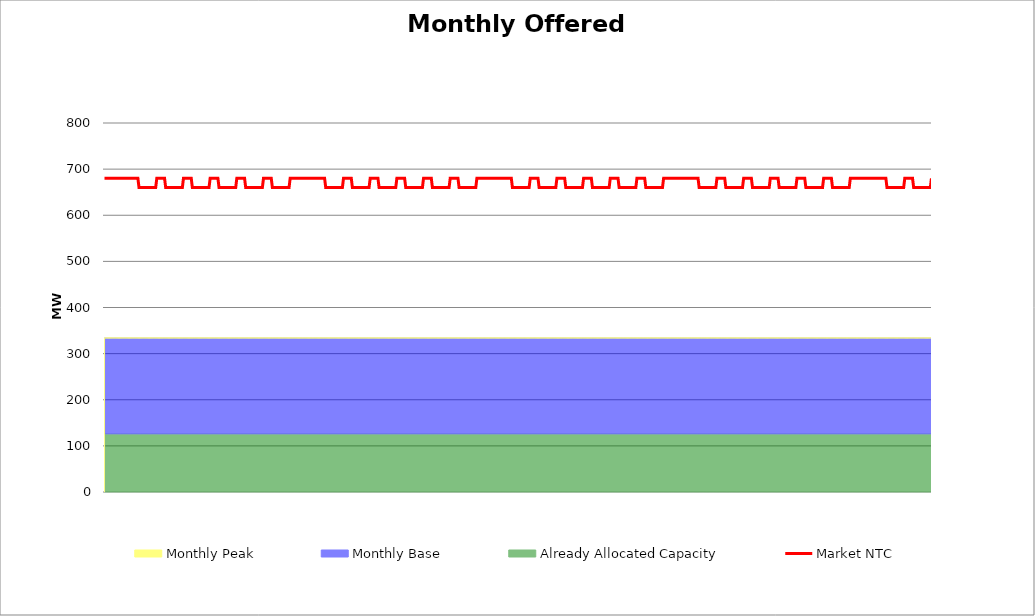
| Category | Market NTC |
|---|---|
| 0 | 680 |
| 1 | 680 |
| 2 | 680 |
| 3 | 680 |
| 4 | 680 |
| 5 | 680 |
| 6 | 680 |
| 7 | 680 |
| 8 | 680 |
| 9 | 680 |
| 10 | 680 |
| 11 | 680 |
| 12 | 680 |
| 13 | 680 |
| 14 | 680 |
| 15 | 680 |
| 16 | 680 |
| 17 | 680 |
| 18 | 680 |
| 19 | 680 |
| 20 | 680 |
| 21 | 680 |
| 22 | 680 |
| 23 | 680 |
| 24 | 680 |
| 25 | 680 |
| 26 | 680 |
| 27 | 680 |
| 28 | 680 |
| 29 | 680 |
| 30 | 680 |
| 31 | 660 |
| 32 | 660 |
| 33 | 660 |
| 34 | 660 |
| 35 | 660 |
| 36 | 660 |
| 37 | 660 |
| 38 | 660 |
| 39 | 660 |
| 40 | 660 |
| 41 | 660 |
| 42 | 660 |
| 43 | 660 |
| 44 | 660 |
| 45 | 660 |
| 46 | 660 |
| 47 | 680 |
| 48 | 680 |
| 49 | 680 |
| 50 | 680 |
| 51 | 680 |
| 52 | 680 |
| 53 | 680 |
| 54 | 680 |
| 55 | 660 |
| 56 | 660 |
| 57 | 660 |
| 58 | 660 |
| 59 | 660 |
| 60 | 660 |
| 61 | 660 |
| 62 | 660 |
| 63 | 660 |
| 64 | 660 |
| 65 | 660 |
| 66 | 660 |
| 67 | 660 |
| 68 | 660 |
| 69 | 660 |
| 70 | 660 |
| 71 | 680 |
| 72 | 680 |
| 73 | 680 |
| 74 | 680 |
| 75 | 680 |
| 76 | 680 |
| 77 | 680 |
| 78 | 680 |
| 79 | 660 |
| 80 | 660 |
| 81 | 660 |
| 82 | 660 |
| 83 | 660 |
| 84 | 660 |
| 85 | 660 |
| 86 | 660 |
| 87 | 660 |
| 88 | 660 |
| 89 | 660 |
| 90 | 660 |
| 91 | 660 |
| 92 | 660 |
| 93 | 660 |
| 94 | 660 |
| 95 | 680 |
| 96 | 680 |
| 97 | 680 |
| 98 | 680 |
| 99 | 680 |
| 100 | 680 |
| 101 | 680 |
| 102 | 680 |
| 103 | 660 |
| 104 | 660 |
| 105 | 660 |
| 106 | 660 |
| 107 | 660 |
| 108 | 660 |
| 109 | 660 |
| 110 | 660 |
| 111 | 660 |
| 112 | 660 |
| 113 | 660 |
| 114 | 660 |
| 115 | 660 |
| 116 | 660 |
| 117 | 660 |
| 118 | 660 |
| 119 | 680 |
| 120 | 680 |
| 121 | 680 |
| 122 | 680 |
| 123 | 680 |
| 124 | 680 |
| 125 | 680 |
| 126 | 680 |
| 127 | 660 |
| 128 | 660 |
| 129 | 660 |
| 130 | 660 |
| 131 | 660 |
| 132 | 660 |
| 133 | 660 |
| 134 | 660 |
| 135 | 660 |
| 136 | 660 |
| 137 | 660 |
| 138 | 660 |
| 139 | 660 |
| 140 | 660 |
| 141 | 660 |
| 142 | 660 |
| 143 | 680 |
| 144 | 680 |
| 145 | 680 |
| 146 | 680 |
| 147 | 680 |
| 148 | 680 |
| 149 | 680 |
| 150 | 680 |
| 151 | 660 |
| 152 | 660 |
| 153 | 660 |
| 154 | 660 |
| 155 | 660 |
| 156 | 660 |
| 157 | 660 |
| 158 | 660 |
| 159 | 660 |
| 160 | 660 |
| 161 | 660 |
| 162 | 660 |
| 163 | 660 |
| 164 | 660 |
| 165 | 660 |
| 166 | 660 |
| 167 | 680 |
| 168 | 680 |
| 169 | 680 |
| 170 | 680 |
| 171 | 680 |
| 172 | 680 |
| 173 | 680 |
| 174 | 680 |
| 175 | 680 |
| 176 | 680 |
| 177 | 680 |
| 178 | 680 |
| 179 | 680 |
| 180 | 680 |
| 181 | 680 |
| 182 | 680 |
| 183 | 680 |
| 184 | 680 |
| 185 | 680 |
| 186 | 680 |
| 187 | 680 |
| 188 | 680 |
| 189 | 680 |
| 190 | 680 |
| 191 | 680 |
| 192 | 680 |
| 193 | 680 |
| 194 | 680 |
| 195 | 680 |
| 196 | 680 |
| 197 | 680 |
| 198 | 680 |
| 199 | 660 |
| 200 | 660 |
| 201 | 660 |
| 202 | 660 |
| 203 | 660 |
| 204 | 660 |
| 205 | 660 |
| 206 | 660 |
| 207 | 660 |
| 208 | 660 |
| 209 | 660 |
| 210 | 660 |
| 211 | 660 |
| 212 | 660 |
| 213 | 660 |
| 214 | 660 |
| 215 | 680 |
| 216 | 680 |
| 217 | 680 |
| 218 | 680 |
| 219 | 680 |
| 220 | 680 |
| 221 | 680 |
| 222 | 680 |
| 223 | 660 |
| 224 | 660 |
| 225 | 660 |
| 226 | 660 |
| 227 | 660 |
| 228 | 660 |
| 229 | 660 |
| 230 | 660 |
| 231 | 660 |
| 232 | 660 |
| 233 | 660 |
| 234 | 660 |
| 235 | 660 |
| 236 | 660 |
| 237 | 660 |
| 238 | 660 |
| 239 | 680 |
| 240 | 680 |
| 241 | 680 |
| 242 | 680 |
| 243 | 680 |
| 244 | 680 |
| 245 | 680 |
| 246 | 680 |
| 247 | 660 |
| 248 | 660 |
| 249 | 660 |
| 250 | 660 |
| 251 | 660 |
| 252 | 660 |
| 253 | 660 |
| 254 | 660 |
| 255 | 660 |
| 256 | 660 |
| 257 | 660 |
| 258 | 660 |
| 259 | 660 |
| 260 | 660 |
| 261 | 660 |
| 262 | 660 |
| 263 | 680 |
| 264 | 680 |
| 265 | 680 |
| 266 | 680 |
| 267 | 680 |
| 268 | 680 |
| 269 | 680 |
| 270 | 680 |
| 271 | 660 |
| 272 | 660 |
| 273 | 660 |
| 274 | 660 |
| 275 | 660 |
| 276 | 660 |
| 277 | 660 |
| 278 | 660 |
| 279 | 660 |
| 280 | 660 |
| 281 | 660 |
| 282 | 660 |
| 283 | 660 |
| 284 | 660 |
| 285 | 660 |
| 286 | 660 |
| 287 | 680 |
| 288 | 680 |
| 289 | 680 |
| 290 | 680 |
| 291 | 680 |
| 292 | 680 |
| 293 | 680 |
| 294 | 680 |
| 295 | 660 |
| 296 | 660 |
| 297 | 660 |
| 298 | 660 |
| 299 | 660 |
| 300 | 660 |
| 301 | 660 |
| 302 | 660 |
| 303 | 660 |
| 304 | 660 |
| 305 | 660 |
| 306 | 660 |
| 307 | 660 |
| 308 | 660 |
| 309 | 660 |
| 310 | 660 |
| 311 | 680 |
| 312 | 680 |
| 313 | 680 |
| 314 | 680 |
| 315 | 680 |
| 316 | 680 |
| 317 | 680 |
| 318 | 680 |
| 319 | 660 |
| 320 | 660 |
| 321 | 660 |
| 322 | 660 |
| 323 | 660 |
| 324 | 660 |
| 325 | 660 |
| 326 | 660 |
| 327 | 660 |
| 328 | 660 |
| 329 | 660 |
| 330 | 660 |
| 331 | 660 |
| 332 | 660 |
| 333 | 660 |
| 334 | 660 |
| 335 | 680 |
| 336 | 680 |
| 337 | 680 |
| 338 | 680 |
| 339 | 680 |
| 340 | 680 |
| 341 | 680 |
| 342 | 680 |
| 343 | 680 |
| 344 | 680 |
| 345 | 680 |
| 346 | 680 |
| 347 | 680 |
| 348 | 680 |
| 349 | 680 |
| 350 | 680 |
| 351 | 680 |
| 352 | 680 |
| 353 | 680 |
| 354 | 680 |
| 355 | 680 |
| 356 | 680 |
| 357 | 680 |
| 358 | 680 |
| 359 | 680 |
| 360 | 680 |
| 361 | 680 |
| 362 | 680 |
| 363 | 680 |
| 364 | 680 |
| 365 | 680 |
| 366 | 680 |
| 367 | 660 |
| 368 | 660 |
| 369 | 660 |
| 370 | 660 |
| 371 | 660 |
| 372 | 660 |
| 373 | 660 |
| 374 | 660 |
| 375 | 660 |
| 376 | 660 |
| 377 | 660 |
| 378 | 660 |
| 379 | 660 |
| 380 | 660 |
| 381 | 660 |
| 382 | 660 |
| 383 | 680 |
| 384 | 680 |
| 385 | 680 |
| 386 | 680 |
| 387 | 680 |
| 388 | 680 |
| 389 | 680 |
| 390 | 680 |
| 391 | 660 |
| 392 | 660 |
| 393 | 660 |
| 394 | 660 |
| 395 | 660 |
| 396 | 660 |
| 397 | 660 |
| 398 | 660 |
| 399 | 660 |
| 400 | 660 |
| 401 | 660 |
| 402 | 660 |
| 403 | 660 |
| 404 | 660 |
| 405 | 660 |
| 406 | 660 |
| 407 | 680 |
| 408 | 680 |
| 409 | 680 |
| 410 | 680 |
| 411 | 680 |
| 412 | 680 |
| 413 | 680 |
| 414 | 680 |
| 415 | 660 |
| 416 | 660 |
| 417 | 660 |
| 418 | 660 |
| 419 | 660 |
| 420 | 660 |
| 421 | 660 |
| 422 | 660 |
| 423 | 660 |
| 424 | 660 |
| 425 | 660 |
| 426 | 660 |
| 427 | 660 |
| 428 | 660 |
| 429 | 660 |
| 430 | 660 |
| 431 | 680 |
| 432 | 680 |
| 433 | 680 |
| 434 | 680 |
| 435 | 680 |
| 436 | 680 |
| 437 | 680 |
| 438 | 680 |
| 439 | 660 |
| 440 | 660 |
| 441 | 660 |
| 442 | 660 |
| 443 | 660 |
| 444 | 660 |
| 445 | 660 |
| 446 | 660 |
| 447 | 660 |
| 448 | 660 |
| 449 | 660 |
| 450 | 660 |
| 451 | 660 |
| 452 | 660 |
| 453 | 660 |
| 454 | 660 |
| 455 | 680 |
| 456 | 680 |
| 457 | 680 |
| 458 | 680 |
| 459 | 680 |
| 460 | 680 |
| 461 | 680 |
| 462 | 680 |
| 463 | 660 |
| 464 | 660 |
| 465 | 660 |
| 466 | 660 |
| 467 | 660 |
| 468 | 660 |
| 469 | 660 |
| 470 | 660 |
| 471 | 660 |
| 472 | 660 |
| 473 | 660 |
| 474 | 660 |
| 475 | 660 |
| 476 | 660 |
| 477 | 660 |
| 478 | 660 |
| 479 | 680 |
| 480 | 680 |
| 481 | 680 |
| 482 | 680 |
| 483 | 680 |
| 484 | 680 |
| 485 | 680 |
| 486 | 680 |
| 487 | 660 |
| 488 | 660 |
| 489 | 660 |
| 490 | 660 |
| 491 | 660 |
| 492 | 660 |
| 493 | 660 |
| 494 | 660 |
| 495 | 660 |
| 496 | 660 |
| 497 | 660 |
| 498 | 660 |
| 499 | 660 |
| 500 | 660 |
| 501 | 660 |
| 502 | 660 |
| 503 | 680 |
| 504 | 680 |
| 505 | 680 |
| 506 | 680 |
| 507 | 680 |
| 508 | 680 |
| 509 | 680 |
| 510 | 680 |
| 511 | 680 |
| 512 | 680 |
| 513 | 680 |
| 514 | 680 |
| 515 | 680 |
| 516 | 680 |
| 517 | 680 |
| 518 | 680 |
| 519 | 680 |
| 520 | 680 |
| 521 | 680 |
| 522 | 680 |
| 523 | 680 |
| 524 | 680 |
| 525 | 680 |
| 526 | 680 |
| 527 | 680 |
| 528 | 680 |
| 529 | 680 |
| 530 | 680 |
| 531 | 680 |
| 532 | 680 |
| 533 | 680 |
| 534 | 680 |
| 535 | 660 |
| 536 | 660 |
| 537 | 660 |
| 538 | 660 |
| 539 | 660 |
| 540 | 660 |
| 541 | 660 |
| 542 | 660 |
| 543 | 660 |
| 544 | 660 |
| 545 | 660 |
| 546 | 660 |
| 547 | 660 |
| 548 | 660 |
| 549 | 660 |
| 550 | 660 |
| 551 | 680 |
| 552 | 680 |
| 553 | 680 |
| 554 | 680 |
| 555 | 680 |
| 556 | 680 |
| 557 | 680 |
| 558 | 680 |
| 559 | 660 |
| 560 | 660 |
| 561 | 660 |
| 562 | 660 |
| 563 | 660 |
| 564 | 660 |
| 565 | 660 |
| 566 | 660 |
| 567 | 660 |
| 568 | 660 |
| 569 | 660 |
| 570 | 660 |
| 571 | 660 |
| 572 | 660 |
| 573 | 660 |
| 574 | 660 |
| 575 | 680 |
| 576 | 680 |
| 577 | 680 |
| 578 | 680 |
| 579 | 680 |
| 580 | 680 |
| 581 | 680 |
| 582 | 680 |
| 583 | 660 |
| 584 | 660 |
| 585 | 660 |
| 586 | 660 |
| 587 | 660 |
| 588 | 660 |
| 589 | 660 |
| 590 | 660 |
| 591 | 660 |
| 592 | 660 |
| 593 | 660 |
| 594 | 660 |
| 595 | 660 |
| 596 | 660 |
| 597 | 660 |
| 598 | 660 |
| 599 | 680 |
| 600 | 680 |
| 601 | 680 |
| 602 | 680 |
| 603 | 680 |
| 604 | 680 |
| 605 | 680 |
| 606 | 680 |
| 607 | 660 |
| 608 | 660 |
| 609 | 660 |
| 610 | 660 |
| 611 | 660 |
| 612 | 660 |
| 613 | 660 |
| 614 | 660 |
| 615 | 660 |
| 616 | 660 |
| 617 | 660 |
| 618 | 660 |
| 619 | 660 |
| 620 | 660 |
| 621 | 660 |
| 622 | 660 |
| 623 | 680 |
| 624 | 680 |
| 625 | 680 |
| 626 | 680 |
| 627 | 680 |
| 628 | 680 |
| 629 | 680 |
| 630 | 680 |
| 631 | 660 |
| 632 | 660 |
| 633 | 660 |
| 634 | 660 |
| 635 | 660 |
| 636 | 660 |
| 637 | 660 |
| 638 | 660 |
| 639 | 660 |
| 640 | 660 |
| 641 | 660 |
| 642 | 660 |
| 643 | 660 |
| 644 | 660 |
| 645 | 660 |
| 646 | 660 |
| 647 | 680 |
| 648 | 680 |
| 649 | 680 |
| 650 | 680 |
| 651 | 680 |
| 652 | 680 |
| 653 | 680 |
| 654 | 680 |
| 655 | 660 |
| 656 | 660 |
| 657 | 660 |
| 658 | 660 |
| 659 | 660 |
| 660 | 660 |
| 661 | 660 |
| 662 | 660 |
| 663 | 660 |
| 664 | 660 |
| 665 | 660 |
| 666 | 660 |
| 667 | 660 |
| 668 | 660 |
| 669 | 660 |
| 670 | 660 |
| 671 | 680 |
| 672 | 680 |
| 673 | 680 |
| 674 | 680 |
| 675 | 680 |
| 676 | 680 |
| 677 | 680 |
| 678 | 680 |
| 679 | 680 |
| 680 | 680 |
| 681 | 680 |
| 682 | 680 |
| 683 | 680 |
| 684 | 680 |
| 685 | 680 |
| 686 | 680 |
| 687 | 680 |
| 688 | 680 |
| 689 | 680 |
| 690 | 680 |
| 691 | 680 |
| 692 | 680 |
| 693 | 680 |
| 694 | 680 |
| 695 | 680 |
| 696 | 680 |
| 697 | 680 |
| 698 | 680 |
| 699 | 680 |
| 700 | 680 |
| 701 | 680 |
| 702 | 680 |
| 703 | 680 |
| 704 | 660 |
| 705 | 660 |
| 706 | 660 |
| 707 | 660 |
| 708 | 660 |
| 709 | 660 |
| 710 | 660 |
| 711 | 660 |
| 712 | 660 |
| 713 | 660 |
| 714 | 660 |
| 715 | 660 |
| 716 | 660 |
| 717 | 660 |
| 718 | 660 |
| 719 | 660 |
| 720 | 680 |
| 721 | 680 |
| 722 | 680 |
| 723 | 680 |
| 724 | 680 |
| 725 | 680 |
| 726 | 680 |
| 727 | 680 |
| 728 | 660 |
| 729 | 660 |
| 730 | 660 |
| 731 | 660 |
| 732 | 660 |
| 733 | 660 |
| 734 | 660 |
| 735 | 660 |
| 736 | 660 |
| 737 | 660 |
| 738 | 660 |
| 739 | 660 |
| 740 | 660 |
| 741 | 660 |
| 742 | 660 |
| 743 | 660 |
| 744 | 680 |